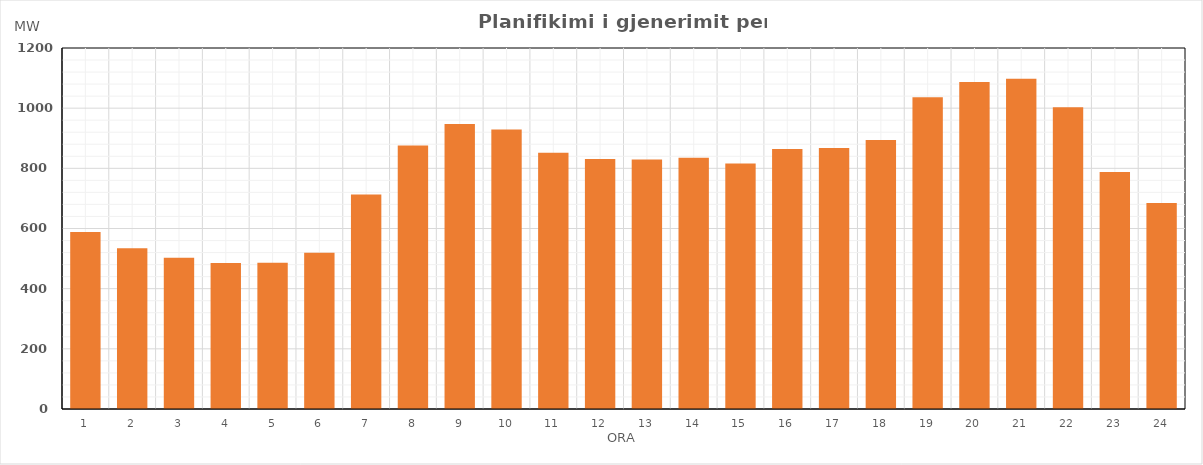
| Category | Max (MW) |
|---|---|
| 0 | 588.55 |
| 1 | 534.24 |
| 2 | 502.94 |
| 3 | 485.43 |
| 4 | 485.94 |
| 5 | 519.09 |
| 6 | 712.75 |
| 7 | 876 |
| 8 | 947.77 |
| 9 | 929.16 |
| 10 | 852.15 |
| 11 | 830.86 |
| 12 | 829.26 |
| 13 | 835.48 |
| 14 | 815.97 |
| 15 | 864.61 |
| 16 | 867.8 |
| 17 | 894.12 |
| 18 | 1036.6 |
| 19 | 1087.32 |
| 20 | 1097.91 |
| 21 | 1003.35 |
| 22 | 787.85 |
| 23 | 684.91 |